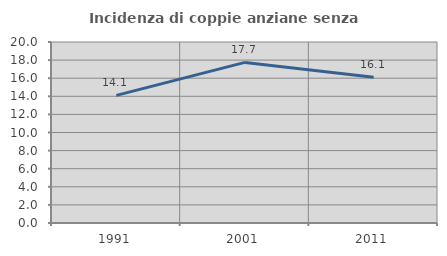
| Category | Incidenza di coppie anziane senza figli  |
|---|---|
| 1991.0 | 14.105 |
| 2001.0 | 17.745 |
| 2011.0 | 16.1 |